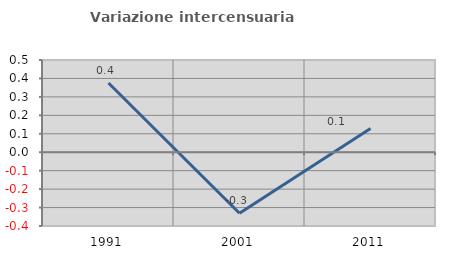
| Category | Variazione intercensuaria annua |
|---|---|
| 1991.0 | 0.376 |
| 2001.0 | -0.331 |
| 2011.0 | 0.129 |